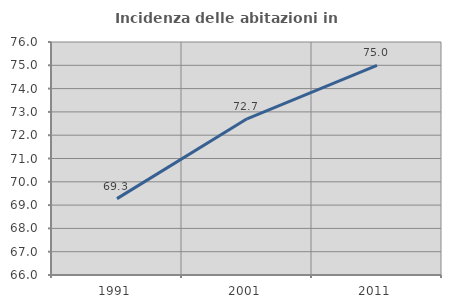
| Category | Incidenza delle abitazioni in proprietà  |
|---|---|
| 1991.0 | 69.279 |
| 2001.0 | 72.702 |
| 2011.0 | 75 |